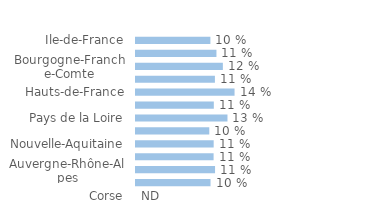
| Category | Series 0 |
|---|---|
| Ile-de-France | 0.102 |
| Centre-Val-de-Loire | 0.11 |
| Bourgogne-Franche-Comte | 0.119 |
| Normandie | 0.108 |
| Hauts-de-France | 0.135 |
| Grand-Est | 0.107 |
| Pays de la Loire | 0.125 |
| Bretagne | 0.1 |
| Nouvelle-Aquitaine | 0.106 |
| Occitanie | 0.106 |
| Auvergne-Rhône-Alpes | 0.108 |
| Provence-Alpes-Côte d'Azur | 0.102 |
| Corse | 0 |